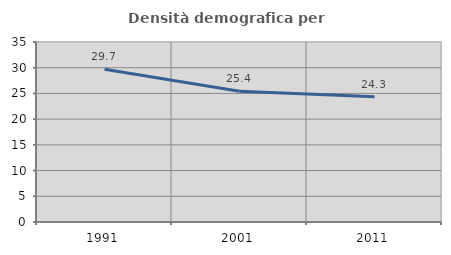
| Category | Densità demografica |
|---|---|
| 1991.0 | 29.682 |
| 2001.0 | 25.439 |
| 2011.0 | 24.347 |